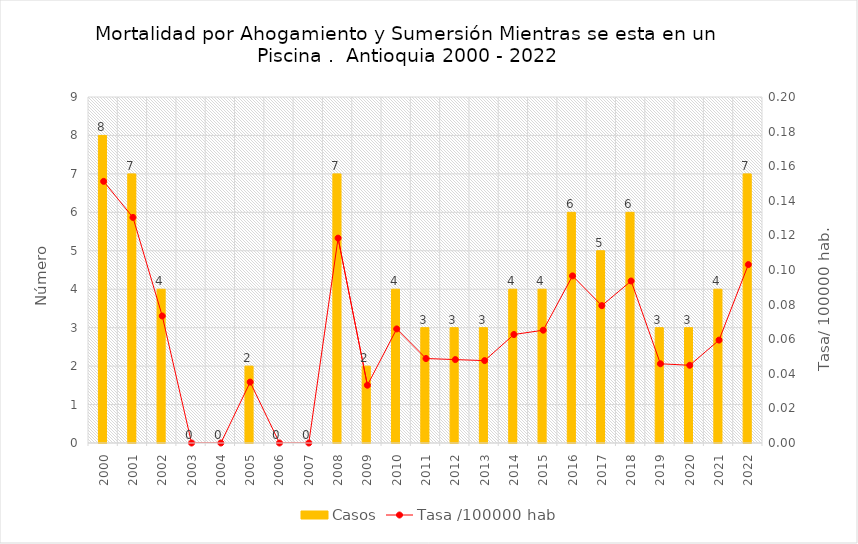
| Category | Casos |
|---|---|
| 2000 | 8 |
| 2001 | 7 |
| 2002 | 4 |
| 2003 | 0 |
| 2004 | 0 |
| 2005 | 2 |
| 2006 | 0 |
| 2007 | 0 |
| 2008 | 7 |
| 2009 | 2 |
| 2010 | 4 |
| 2011 | 3 |
| 2012 | 3 |
| 2013 | 3 |
| 2014 | 4 |
| 2015 | 4 |
| 2016 | 6 |
| 2017 | 5 |
| 2018 | 6 |
| 2019 | 3 |
| 2020 | 3 |
| 2021 | 4 |
| 2022 | 7 |